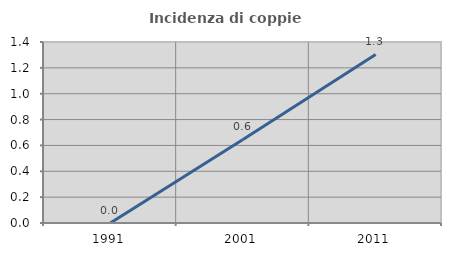
| Category | Incidenza di coppie miste |
|---|---|
| 1991.0 | 0 |
| 2001.0 | 0.647 |
| 2011.0 | 1.304 |